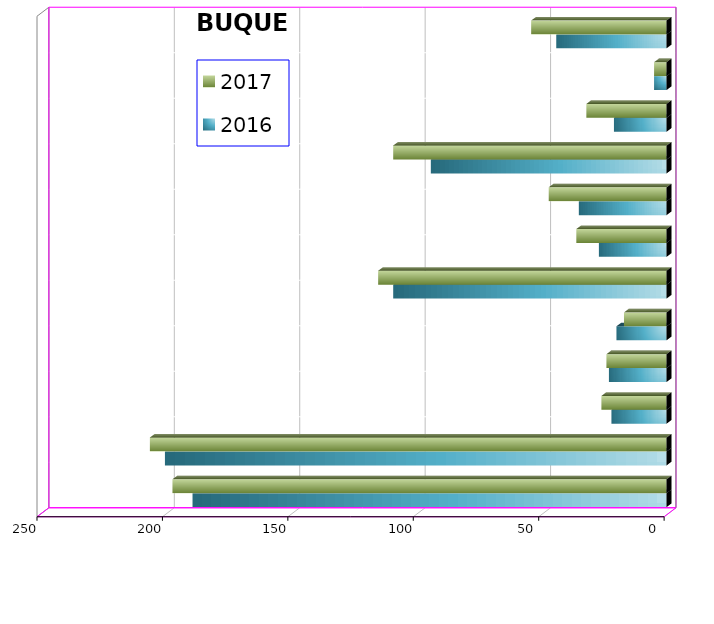
| Category | 2016 | 2017 |
|---|---|---|
| ICAVE | 189 | 197 |
| CICE | 200 | 206 |
| T. C. E. | 22 | 26 |
| CARGILL | 23 | 24 |
| TMV | 20 | 17 |
| SSA | 109 | 115 |
| SEPSA | 27 | 36 |
| VOPAK | 35 | 47 |
| CPV | 94 | 109 |
| EXCELLENCE | 21 | 32 |
| SIP | 5 | 5 |
| PEMEX | 44 | 54 |